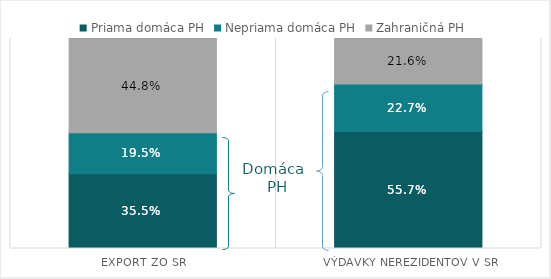
| Category | Podiel odvetvia na celkovej produkcii spolu |
|---|---|
| 29 | 0.131 |
| 45T47 | 0.09 |
| 41T43 | 0.081 |
| 69T82 | 0.077 |
| 49T53 | 0.065 |
| 35T39 | 0.059 |
| 68 | 0.04 |
| 84 | 0.035 |
| 25 | 0.034 |
| 26 | 0.031 |
| 01T03 | 0.029 |
| 64T66 | 0.028 |
| 28 | 0.023 |
| 22 | 0.023 |
| 86T88 | 0.022 |
| 90T96 | 0.022 |
| 24 | 0.021 |
| 10T12 | 0.02 |
| 85 | 0.019 |
| 27 | 0.019 |
| 19 | 0.018 |
| 62T63 | 0.017 |
| 31T33 | 0.017 |
| 20T21 | 0.011 |
| 55T56 | 0.011 |
| 16 | 0.011 |
| 61 | 0.01 |
| 17T18 | 0.009 |
| 23 | 0.009 |
| 13T15 | 0.008 |
| 58T60 | 0.005 |
| 30 | 0.002 |
| 07T08 | 0.002 |
| 05T06 | 0.001 |
| 97T98 | 0.001 |
| 09 | 0.001 |